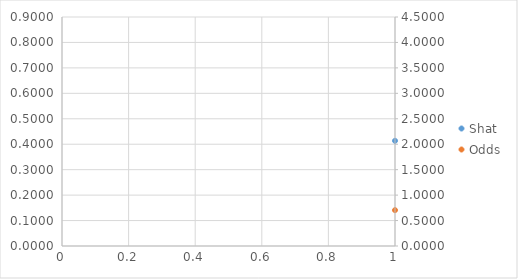
| Category | Shat |
|---|---|
| 0 | 0.413 |
| 1 | 0.401 |
| 2 | 0.413 |
| 3 | 0.45 |
| 4 | 0.512 |
| 5 | 0.599 |
| 6 | 0.701 |
| 7 | 0.802 |